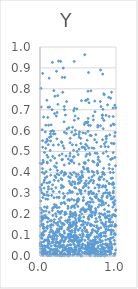
| Category | Series 0 |
|---|---|
| 0.10005947869981213 | 0.143 |
| 0.7445378313837614 | 0.294 |
| 0.43054060785528625 | 0.355 |
| 0.8630222613279245 | 0.336 |
| 0.7097267666635523 | 0.515 |
| 0.9165853605512814 | 0.007 |
| 0.1636997151240278 | 0.6 |
| 0.12031105227243544 | 0.851 |
| 0.3989803611448136 | 0.2 |
| 0.5937657782751368 | 0.639 |
| 0.8635882616032824 | 0.054 |
| 0.7287658117575289 | 0.028 |
| 0.5123858076969392 | 0.582 |
| 0.661117129698669 | 0.277 |
| 0.6094726828337561 | 0.745 |
| 0.46205400400438745 | 0.67 |
| 0.7003078070373357 | 0.013 |
| 0.8784946279181295 | 0.055 |
| 0.7924498252195591 | 0.004 |
| 0.7418793047803254 | 0.006 |
| 0.3208801798566193 | 0.593 |
| 0.6749692163662122 | 0.209 |
| 0.21782785934607152 | 0.445 |
| 0.9252433840730637 | 0.07 |
| 0.5034362676467412 | 0.39 |
| 0.7201226673238331 | 0.014 |
| 0.8017776033466113 | 0.02 |
| 0.5052967034909387 | 0.087 |
| 0.8033092494327827 | 0.11 |
| 0.7835920786173919 | 0.365 |
| 0.5067198892116997 | 0.019 |
| 0.29130712618294596 | 0.087 |
| 0.7187526788977328 | 0.018 |
| 0.08048620076550639 | 0.545 |
| 0.03182879926721438 | 0.418 |
| 0.07997170008571153 | 0.404 |
| 0.16299383746125584 | 0.119 |
| 0.4438434806434466 | 0.4 |
| 0.758897675626249 | 0.038 |
| 0.6080253942944378 | 0.336 |
| 0.03026466850193088 | 0.401 |
| 0.349664673779262 | 0.739 |
| 0.6541800906229215 | 0.005 |
| 0.6313878557279019 | 0.788 |
| 0.2657184033991986 | 0.166 |
| 0.7918979715776909 | 0.075 |
| 0.13531090307451177 | 0.413 |
| 0.8797384263612631 | 0.058 |
| 0.7122122962614431 | 0.145 |
| 0.022612676940649612 | 0.343 |
| 0.7038670591202029 | 0.4 |
| 0.06928909977648423 | 0.594 |
| 0.9338999021274117 | 0.624 |
| 0.9172055125395175 | 0.58 |
| 0.2928808077457361 | 0.855 |
| 0.8890523921128682 | 0.723 |
| 0.4417450240718055 | 0.506 |
| 0.19169418839615093 | 0.43 |
| 0.09969122263481289 | 0.073 |
| 0.8191094995074694 | 0.33 |
| 0.43973961297535324 | 0.473 |
| 0.2322028022714917 | 0.113 |
| 0.4497094916434805 | 0.931 |
| 0.011666211031531759 | 0.802 |
| 0.4042130408742949 | 0.204 |
| 0.2495374828566702 | 0.28 |
| 0.44357555218036315 | 0.15 |
| 0.8356040040496929 | 0.149 |
| 0.9555424806792121 | 0.162 |
| 0.29296256269814136 | 0.02 |
| 0.7851707170205758 | 0.187 |
| 0.9432235512853036 | 0.186 |
| 0.39934112240760267 | 0.017 |
| 0.8342210221445432 | 0.398 |
| 0.1708517440549171 | 0.11 |
| 0.633686262879085 | 0.225 |
| 0.6821782333649639 | 0.057 |
| 0.942841582585219 | 0.277 |
| 0.8642399651534727 | 0.077 |
| 0.7573118247019488 | 0.018 |
| 0.6587339549849187 | 0.024 |
| 0.05686589710546974 | 0.049 |
| 0.5215883229401814 | 0.072 |
| 0.6553243074449455 | 0.222 |
| 0.27680429236506154 | 0.184 |
| 0.8763295407086023 | 0.141 |
| 0.11136745482231014 | 0.321 |
| 0.16300426735947704 | 0.012 |
| 0.9105380790470909 | 0.438 |
| 0.9812943476231264 | 0.141 |
| 0.1843511507801644 | 0.032 |
| 0.8466326663791226 | 0.537 |
| 0.5181954103897375 | 0.194 |
| 0.30675062375419426 | 0.899 |
| 0.574999923362885 | 0.187 |
| 0.6557444137023243 | 0.485 |
| 0.40046611045646885 | 0.104 |
| 0.8787049950914343 | 0.573 |
| 0.6317477301085012 | 0.596 |
| 0.2731755349815663 | 0.046 |
| 0.058162191623783 | 0.071 |
| 0.12010398470827743 | 0.002 |
| 0.7467943281750345 | 0.137 |
| 0.9300959059781894 | 0.021 |
| 0.7308346773350012 | 0.059 |
| 0.46100930334965795 | 0.113 |
| 0.9058651164642031 | 0.043 |
| 0.6166225163946337 | 0.487 |
| 0.48602892122445684 | 0.704 |
| 0.4434908909907642 | 0.069 |
| 0.1417926599464856 | 0.003 |
| 0.566306441189867 | 0.326 |
| 0.3263061173754387 | 0.399 |
| 0.6811130888307021 | 0.187 |
| 0.7110240222283751 | 0.049 |
| 0.46091444940374793 | 0.04 |
| 0.054023461053276156 | 0.325 |
| 0.5312892187073107 | 0.035 |
| 0.31365110018370146 | 0.067 |
| 0.8545953921807845 | 0.014 |
| 0.0014893267014393086 | 0.047 |
| 0.017575329024499764 | 0.206 |
| 0.3087176924503304 | 0.33 |
| 0.4747696073553378 | 0.247 |
| 0.051538338839615894 | 0.292 |
| 0.09798102592095204 | 0.162 |
| 0.5222775390768457 | 0.351 |
| 0.22775697738634904 | 0.094 |
| 0.51367566166667 | 0.035 |
| 0.593404318458394 | 0.052 |
| 0.1643648376232637 | 0.028 |
| 0.6113574752132708 | 0.029 |
| 0.4276904855941217 | 0.307 |
| 0.9391030597206951 | 0.114 |
| 0.5625921340951926 | 0.058 |
| 0.7613014772407035 | 0.064 |
| 0.2783794897649168 | 0.25 |
| 0.686774478431224 | 0.405 |
| 0.7202595159701953 | 0.089 |
| 0.5506136604619367 | 0.001 |
| 0.3952175950402411 | 0.119 |
| 0.7585693539133623 | 0.434 |
| 0.6007606910871399 | 0.535 |
| 0.903863519514909 | 0.759 |
| 0.31027220387384635 | 0.052 |
| 0.253842787553743 | 0.481 |
| 0.4315993728213461 | 0.189 |
| 0.7300229222903388 | 0.164 |
| 0.11502004537350208 | 0.003 |
| 0.844982349091273 | 0.024 |
| 0.4504680581524416 | 0.09 |
| 0.49238475764072176 | 0.297 |
| 0.6664044295342217 | 0.153 |
| 0.3168728163324743 | 0.15 |
| 0.00695215168565444 | 0.063 |
| 0.9721971071560779 | 0.327 |
| 0.08218943597758888 | 0.077 |
| 0.9749267108533186 | 0.003 |
| 0.09996595126507579 | 0.552 |
| 0.8091651708428228 | 0.242 |
| 0.04349086053404316 | 0.1 |
| 0.10626809439953178 | 0.002 |
| 0.669387652936136 | 0.31 |
| 0.2149052880733785 | 0.19 |
| 0.8905520458543791 | 0.302 |
| 0.46004031597911776 | 0.345 |
| 0.3803297650766245 | 0.138 |
| 0.9406845821222647 | 0.784 |
| 0.39870386454200357 | 0.395 |
| 0.8093875648933189 | 0.003 |
| 0.9019432819355105 | 0.048 |
| 0.48504284132457043 | 0.268 |
| 0.756187765223229 | 0.063 |
| 0.38481610247683185 | 0.357 |
| 0.4540878563477837 | 0.029 |
| 0.2545283872887647 | 0.128 |
| 0.676394745749286 | 0.364 |
| 0.722066881766388 | 0.196 |
| 0.9424857066479063 | 0.125 |
| 0.8612176050840341 | 0.152 |
| 0.5829307775144627 | 0.629 |
| 0.5473396422552135 | 0.041 |
| 0.2354628959305528 | 0.213 |
| 0.7536669051343439 | 0.068 |
| 0.32536190315899705 | 0.854 |
| 0.32575899615767223 | 0.008 |
| 0.431349361599091 | 0.03 |
| 0.04269093819013858 | 0.112 |
| 0.47348568804284286 | 0.011 |
| 0.5916055239252378 | 0.075 |
| 0.11974169366412313 | 0.069 |
| 0.3952520805961037 | 0.054 |
| 0.5508029635362461 | 0.201 |
| 0.6602613376932361 | 0.099 |
| 0.6575748742939462 | 0.195 |
| 0.26891781429918427 | 0.013 |
| 0.7865667012739112 | 0.079 |
| 0.8938622109990406 | 0.125 |
| 0.9241161754881684 | 0.014 |
| 0.028871181046662975 | 0.172 |
| 0.14725966220475328 | 0.122 |
| 0.6737425857995373 | 0.576 |
| 0.9547115888702261 | 0.196 |
| 0.9954131040679962 | 0.029 |
| 0.40073662963594214 | 0.456 |
| 0.12314266489298875 | 0.02 |
| 0.7067104434800168 | 0.36 |
| 0.20650817861703563 | 0.05 |
| 0.17888345991422694 | 0.597 |
| 0.8325519650644809 | 0.491 |
| 0.4498342967078305 | 0.007 |
| 0.9650353958083112 | 0.538 |
| 0.44214756406803246 | 0.058 |
| 0.7720292307480524 | 0.128 |
| 0.43474817332979576 | 0.071 |
| 0.04408048880767068 | 0.132 |
| 0.8887452069449642 | 0.212 |
| 0.7574044283492841 | 0.341 |
| 0.2688386559354292 | 0.046 |
| 0.8211674646626055 | 0.071 |
| 0.03314027736723513 | 0.19 |
| 0.5528786015885647 | 0.4 |
| 0.37772941039907104 | 0.269 |
| 0.964380346531579 | 0.089 |
| 0.8933128465249822 | 0.081 |
| 0.9099069941289507 | 0.667 |
| 0.5557114963875774 | 0.166 |
| 0.512949734629897 | 0.022 |
| 0.6626367593987135 | 0.624 |
| 0.6596037901145356 | 0.149 |
| 0.9430313453572345 | 0.464 |
| 0.07526149648039582 | 0.515 |
| 0.5657214786926443 | 0.59 |
| 0.7592705543421319 | 0.118 |
| 0.2271344789746953 | 0.392 |
| 0.5429946806685568 | 0.072 |
| 0.3886607574110823 | 0.1 |
| 0.2440163676436523 | 0.933 |
| 0.016038840159648293 | 0.713 |
| 0.004645562697447869 | 0.096 |
| 0.4715918837265952 | 0.171 |
| 0.6642870153420836 | 0.223 |
| 0.16229240714881477 | 0.218 |
| 0.6464140123381407 | 0.01 |
| 0.03346968773221759 | 0.05 |
| 0.681265641456944 | 0.148 |
| 0.3191109046586035 | 0.436 |
| 0.6037554169918973 | 0.344 |
| 0.5155837307712833 | 0.047 |
| 0.5883748322517915 | 0.963 |
| 0.25196977220713557 | 0.232 |
| 0.05902964885287987 | 0.013 |
| 0.23378754007508418 | 0.767 |
| 0.7855636983774172 | 0.377 |
| 0.7933019345617327 | 0.739 |
| 0.3712481320734349 | 0.134 |
| 0.866156531903306 | 0.572 |
| 0.9679697012738092 | 0.198 |
| 0.860128247456905 | 0.303 |
| 0.7315283970564934 | 0.063 |
| 0.7665151679758214 | 0.133 |
| 0.07513257593989286 | 0.545 |
| 0.4672696311982196 | 0.095 |
| 0.36725073336984815 | 0.228 |
| 0.8279709778574713 | 0.702 |
| 0.8030338670018171 | 0.524 |
| 0.8782684436973298 | 0.316 |
| 0.8911405068261886 | 0.191 |
| 0.8200909158756926 | 0.158 |
| 0.6727429210462079 | 0.214 |
| 0.5587291717005823 | 0.148 |
| 0.5317576183440097 | 0.183 |
| 0.48934244710960373 | 0.265 |
| 0.7354029802799369 | 0.209 |
| 0.46183929285896397 | 0.131 |
| 0.2925938144354957 | 0.098 |
| 0.6718407447976029 | 0.032 |
| 0.19263142229345387 | 0.468 |
| 0.9551297588859718 | 0.373 |
| 0.19285318968806953 | 0.008 |
| 0.11245644085033046 | 0.626 |
| 0.11012014122321123 | 0.331 |
| 0.5686919065350118 | 0.151 |
| 0.13913439283394458 | 0.55 |
| 0.9143186791985006 | 0.079 |
| 0.7671915727152859 | 0.271 |
| 0.7595533119901697 | 0.396 |
| 0.6739262483281027 | 0.109 |
| 0.35815232096513394 | 0.022 |
| 0.4636010201506958 | 0.041 |
| 0.19772422438597625 | 0.584 |
| 0.8477532165405525 | 0 |
| 0.8826490308326922 | 0.05 |
| 0.04113095588336013 | 0.004 |
| 0.4304472678792396 | 0.161 |
| 0.37110699026893257 | 0.105 |
| 0.4202136665972257 | 0.122 |
| 0.21485834516508462 | 0.67 |
| 0.4989650893541351 | 0.237 |
| 0.07276314651617988 | 0.12 |
| 0.28248988557697385 | 0.547 |
| 0.8146347706086617 | 0.004 |
| 0.20422568763640558 | 0.048 |
| 0.2734443964118898 | 0.097 |
| 0.3684981203569022 | 0.008 |
| 0.8046432660146257 | 0.202 |
| 0.45996116122931463 | 0.122 |
| 0.021232561617691714 | 0.34 |
| 0.2799419081469655 | 0.001 |
| 0.5525639247415998 | 0.52 |
| 0.5845284383437503 | 0.519 |
| 0.8367442697527886 | 0.419 |
| 0.3873427085184815 | 0.098 |
| 0.15136968854694777 | 0.17 |
| 0.27687449505805395 | 0.37 |
| 0.8025387242125401 | 0.715 |
| 0.5693211098908796 | 0.265 |
| 0.06418817984263359 | 0.024 |
| 0.5374931382095133 | 0.024 |
| 0.7820065269940704 | 0.203 |
| 0.28582768209877685 | 0.155 |
| 0.12475222802142283 | 0.057 |
| 0.022611825828253496 | 0.22 |
| 0.6277802495694685 | 0.639 |
| 0.03198719359011348 | 0.045 |
| 0.4460728449092839 | 0.022 |
| 0.9930978811195681 | 0.191 |
| 0.9348918285202946 | 0.014 |
| 0.31606128621074636 | 0.642 |
| 0.9166183640992986 | 0.303 |
| 0.32156633221287967 | 0.029 |
| 0.26025775750195923 | 0.14 |
| 0.7178103601902595 | 0.033 |
| 0.2161705813867527 | 0.003 |
| 0.480949218330198 | 0.077 |
| 0.19615387817771357 | 0.764 |
| 0.5294324867019804 | 0.007 |
| 0.9993674720956293 | 0.146 |
| 0.6181557014816518 | 0.094 |
| 0.6382642477687822 | 0.878 |
| 0.38978203685485324 | 0.266 |
| 0.7073257171165988 | 0.05 |
| 0.913285513457537 | 0.193 |
| 0.7349973998958622 | 0.032 |
| 0.38587751625898314 | 0.087 |
| 0.07627049096563543 | 0.626 |
| 0.24749562443121975 | 0.061 |
| 0.22588792875948283 | 0.115 |
| 0.47085194924348217 | 0.154 |
| 0.6486429840216764 | 0.055 |
| 0.10377085397682095 | 0.001 |
| 0.26657285292328536 | 0.204 |
| 0.3930558374427827 | 0.478 |
| 0.7346770614415787 | 0.219 |
| 0.5163101272744196 | 0.167 |
| 0.6802508247863805 | 0.012 |
| 0.6553277912725691 | 0.193 |
| 0.5561846364591516 | 0.121 |
| 0.6943201198608615 | 0.03 |
| 0.2293452327258677 | 0.41 |
| 0.4895374630865206 | 0.077 |
| 0.5790935847697538 | 0.416 |
| 0.3696819246729375 | 0.173 |
| 0.6386571682292365 | 0.626 |
| 0.7793025168808232 | 0.337 |
| 0.47551455151307576 | 0.044 |
| 0.9622054108352334 | 0.257 |
| 0.42343896865061426 | 0.115 |
| 0.8006663313245564 | 0.266 |
| 0.42712414009486144 | 0.025 |
| 0.9924868212540667 | 0.218 |
| 0.14778938609392722 | 0.048 |
| 0.1437548814331695 | 0.572 |
| 0.10636134830161081 | 0.712 |
| 0.9142494474527716 | 0.178 |
| 0.7024585840397701 | 0.209 |
| 0.5255858179997775 | 0.101 |
| 0.7379577270951871 | 0.179 |
| 0.555500609127446 | 0.052 |
| 0.03794466298370103 | 0.179 |
| 0.19780095210043191 | 0.018 |
| 0.8312238859107838 | 0.01 |
| 0.8182202115637429 | 0.02 |
| 0.1297802942208357 | 0.016 |
| 0.904687218219109 | 0.297 |
| 0.7784623702779884 | 0.264 |
| 0.9441669303600607 | 0.039 |
| 0.5464704101738356 | 0.148 |
| 0.4111346997928532 | 0.096 |
| 0.6581673117613183 | 0.357 |
| 0.7926839763562441 | 0.094 |
| 0.09819950472813666 | 0.019 |
| 0.23559000001392993 | 0.004 |
| 0.18409005331610584 | 0.078 |
| 0.16986865115042438 | 0.194 |
| 0.917506587026175 | 0.168 |
| 0.08660952384822629 | 0.291 |
| 0.056765328681819605 | 0.394 |
| 0.46286398757069713 | 0.209 |
| 0.2504764104519983 | 0.281 |
| 0.5376612159909069 | 0 |
| 0.766136210554619 | 0.234 |
| 0.61802474134755 | 0.149 |
| 0.38620794559051697 | 0.15 |
| 0.9639793815194428 | 0.302 |
| 0.8729712994918841 | 0.5 |
| 0.09210163974448238 | 0.38 |
| 0.451551956694636 | 0.649 |
| 0.4177783096235893 | 0.272 |
| 0.07090507563889126 | 0.374 |
| 0.365167368170656 | 0.268 |
| 0.5405324677804243 | 0.002 |
| 0.4826544226346241 | 0.16 |
| 0.017894889717262386 | 0.016 |
| 0.6298103761295364 | 0.75 |
| 0.21745488671607827 | 0.884 |
| 0.04404166407263976 | 0.067 |
| 0.5137800686861382 | 0.175 |
| 0.7647815617761763 | 0.046 |
| 0.060244002738363056 | 0.234 |
| 0.5622294893412422 | 0.378 |
| 0.4610227617167927 | 0.074 |
| 0.554256594708845 | 0.04 |
| 0.17874025892584844 | 0.584 |
| 0.37867610559054077 | 0.012 |
| 0.3140449050404437 | 0.07 |
| 0.5564067189316539 | 0.122 |
| 0.30299303389793597 | 0.527 |
| 0.06764631461586101 | 0.015 |
| 0.2700047564953496 | 0.065 |
| 0.6775103190564966 | 0.238 |
| 0.4105165370719396 | 0.074 |
| 0.3926330998527383 | 0.08 |
| 0.07842463613931738 | 0.043 |
| 0.1832885489285796 | 0.161 |
| 0.9346958083880466 | 0.272 |
| 0.6943364268132837 | 0.454 |
| 0.04167367351822304 | 0.188 |
| 0.03316156510482837 | 0.552 |
| 0.16350518268642733 | 0.08 |
| 0.22510149642891697 | 0.033 |
| 0.0923798863238523 | 0.139 |
| 0.19574145971209955 | 0.384 |
| 0.6957252076240931 | 0.023 |
| 0.21608587298388848 | 0.019 |
| 0.847981354440766 | 0.007 |
| 0.4944819938961984 | 0.004 |
| 0.965386639810704 | 0.31 |
| 0.561215444626206 | 0.016 |
| 0.8986169889543645 | 0.021 |
| 0.39805127439518717 | 0.346 |
| 0.12344876830887275 | 0.037 |
| 0.9040577596728738 | 0.033 |
| 0.813168745934918 | 0.018 |
| 0.7349182221980097 | 0.581 |
| 0.18628418371901012 | 0.095 |
| 0.1750805972994992 | 0.309 |
| 0.5265132388523813 | 0.379 |
| 0.4699743590294515 | 0.131 |
| 0.8968587276415232 | 0.126 |
| 0.3956937035034348 | 0.146 |
| 0.764910063928205 | 0.024 |
| 0.7020920049035496 | 0.651 |
| 0.7518897451570211 | 0.491 |
| 0.6068122390889117 | 0.046 |
| 0.06837905452172399 | 0.195 |
| 0.007387868170267375 | 0.018 |
| 0.5405841430731395 | 0.222 |
| 0.2735425841359851 | 0.073 |
| 0.5069685617690979 | 0.012 |
| 0.07270622657666137 | 0.046 |
| 0.3070254235496407 | 0.299 |
| 0.3439176798436703 | 0.202 |
| 0.6384417587273533 | 0.037 |
| 0.9503795864794164 | 0.343 |
| 0.5950711629716261 | 0.447 |
| 0.014669128168392387 | 0.188 |
| 0.63884012860272 | 0.187 |
| 0.18813082126999303 | 0.362 |
| 0.970680481099592 | 0.283 |
| 0.3637104055246281 | 0.127 |
| 0.929741548882098 | 0.755 |
| 0.40349823278492003 | 0.105 |
| 0.41800040468628485 | 0.453 |
| 0.934971771894662 | 0.062 |
| 0.9767462196823684 | 0.194 |
| 0.3845615503165677 | 0.443 |
| 0.6274379227026118 | 0.043 |
| 0.36341787081916765 | 0.052 |
| 0.28984037791281614 | 0.051 |
| 0.4936734993672477 | 0.067 |
| 0.46830406245196077 | 0.2 |
| 0.3890586207143055 | 0.313 |
| 0.7104365918522202 | 0.387 |
| 0.7518555614534216 | 0.165 |
| 0.3957409539699186 | 0.136 |
| 0.631107384569193 | 0.159 |
| 0.7923850690888616 | 0.033 |
| 0.5667264114056368 | 0.23 |
| 0.2827427642692627 | 0.13 |
| 0.288495390805676 | 0.14 |
| 0.7961333802543007 | 0.623 |
| 0.36736528596094364 | 0.051 |
| 0.39792827830576416 | 0.563 |
| 0.7238213294553322 | 0.326 |
| 0.6994464221289396 | 0.67 |
| 0.4993934486378053 | 0.262 |
| 0.8313537376574572 | 0.609 |
| 0.4263128773165422 | 0.142 |
| 0.10673415273830977 | 0.08 |
| 0.3225741519952936 | 0.11 |
| 0.9818648495096978 | 0.573 |
| 0.9980209443198514 | 0.221 |
| 0.9115843577501281 | 0.419 |
| 0.12448056738420721 | 0.568 |
| 0.03677126034743994 | 0.149 |
| 0.2777173247424757 | 0.397 |
| 0.03730235590298947 | 0.036 |
| 0.7978142383412998 | 0.172 |
| 0.2109438048433393 | 0.375 |
| 0.6525527752312029 | 0.007 |
| 0.38203839343071555 | 0.038 |
| 0.25728860367343864 | 0.066 |
| 0.40025055978320123 | 0.09 |
| 0.44354799978491277 | 0.695 |
| 0.1474000845012905 | 0.032 |
| 0.6415326868762692 | 0.306 |
| 0.5048079551477731 | 0.365 |
| 0.04528023907946477 | 0.019 |
| 0.14591898090581823 | 0.125 |
| 0.41829260834262183 | 0.388 |
| 0.008170951084375488 | 0.145 |
| 0.034783327601892844 | 0.874 |
| 0.29946636670736526 | 0.783 |
| 0.8978203720565261 | 0.523 |
| 0.7118131276415984 | 0.072 |
| 0.0944592013765686 | 0.235 |
| 0.3852915285174784 | 0.014 |
| 0.8131419388215692 | 0.255 |
| 0.20649180912388032 | 0.112 |
| 0.1635733243299201 | 0.926 |
| 0.3127801998801726 | 0.277 |
| 0.02789209196505993 | 0.085 |
| 0.7835719142435517 | 0.366 |
| 0.025790630282838345 | 0.303 |
| 0.016196427528462287 | 0.107 |
| 0.6964350055925389 | 0.076 |
| 0.27284776246188547 | 0.211 |
| 0.9617737547554462 | 0.708 |
| 0.1202922222451962 | 0.209 |
| 0.028557326892020063 | 0.604 |
| 0.6244314421921099 | 0.113 |
| 0.3364955189391363 | 0.169 |
| 0.7363761209674813 | 0.279 |
| 0.8733034881819923 | 0.022 |
| 0.09180227314334788 | 0.23 |
| 0.8308392749279534 | 0.196 |
| 0.5814925486618605 | 0.222 |
| 0.2567048934675682 | 0.042 |
| 0.21783380136738562 | 0.027 |
| 0.8097562317517566 | 0.379 |
| 0.07064650219544366 | 0.028 |
| 0.3392008928110237 | 0.081 |
| 0.3766123602331253 | 0.033 |
| 0.8397295118290238 | 0.776 |
| 0.921591862409581 | 0.175 |
| 0.2896984677280513 | 0.366 |
| 0.637439648041338 | 0.088 |
| 0.4106997269317222 | 0.345 |
| 0.6600851190806007 | 0.577 |
| 0.7729688755486284 | 0.369 |
| 0.35807948398760003 | 0.09 |
| 0.21971756447423663 | 0.013 |
| 0.20886293242488474 | 0.327 |
| 0.6336351580809476 | 0.41 |
| 0.6723434672714171 | 0.231 |
| 0.5963278281386285 | 0.16 |
| 0.6801896543574101 | 0.048 |
| 0.5086009976722116 | 0.181 |
| 0.5787654506371632 | 0.333 |
| 0.8477225049961102 | 0.141 |
| 0.1377614790102819 | 0.091 |
| 0.9243159428573369 | 0.123 |
| 0.05244068039090122 | 0.027 |
| 0.046036489082293075 | 0.14 |
| 0.16632556254340758 | 0.477 |
| 0.46471583198017374 | 0.601 |
| 0.2283882518452871 | 0.129 |
| 0.28715315782242345 | 0.461 |
| 0.03428605832592013 | 0.028 |
| 0.9128737708038432 | 0.023 |
| 0.7008301896550985 | 0.022 |
| 0.3172086531823204 | 0.257 |
| 0.16468019684419755 | 0.065 |
| 0.7976236830840744 | 0.021 |
| 0.859245457151165 | 0.109 |
| 0.7598287126240715 | 0.617 |
| 0.5101938428801216 | 0.269 |
| 0.25455552370503776 | 0.307 |
| 0.5990935173268164 | 0.587 |
| 0.5285498558801071 | 0.308 |
| 0.3333039756827235 | 0.21 |
| 0.2460023146574135 | 0.211 |
| 0.6705744789103565 | 0.145 |
| 0.44536326748563193 | 0.162 |
| 0.40029651918895437 | 0.212 |
| 0.10249028715522068 | 0.663 |
| 0.2866794985428407 | 0.405 |
| 0.15252169846281838 | 0.321 |
| 0.7237230107732979 | 0.69 |
| 0.7014169874395318 | 0.258 |
| 0.3404868834095399 | 0.392 |
| 0.5053853326053492 | 0.069 |
| 0.22156820959021395 | 0.281 |
| 0.8763311825787274 | 0.005 |
| 0.7425454102029655 | 0.283 |
| 0.9561093818101721 | 0.416 |
| 0.4485074419196794 | 0.267 |
| 0.059545399666081855 | 0.495 |
| 0.19220856487707472 | 0.006 |
| 0.7809600959615944 | 0.245 |
| 0.28367676493437755 | 0.253 |
| 0.29160847870314044 | 0.002 |
| 0.004691958905367333 | 0.06 |
| 0.799803454845614 | 0.136 |
| 0.9265578473437108 | 0.289 |
| 0.18759670897953096 | 0.02 |
| 0.5046062968232681 | 0.123 |
| 0.7133591000589992 | 0.038 |
| 0.2576859308298799 | 0.001 |
| 0.4432776083036324 | 0.092 |
| 0.29070152496692336 | 0.488 |
| 0.4092537949155287 | 0.232 |
| 0.6575440197808905 | 0.259 |
| 0.416508109800827 | 0.34 |
| 0.2154989298911002 | 0.07 |
| 0.3546916974993517 | 0.608 |
| 0.4712740165474947 | 0.325 |
| 0.6434359344644645 | 0.1 |
| 0.5937587660300139 | 0.311 |
| 0.10538147746866933 | 0.472 |
| 0.9417235329953 | 0.043 |
| 0.9091414365512998 | 0.164 |
| 0.313994137648987 | 0.153 |
| 0.39108865307009044 | 0.023 |
| 0.18936640644695513 | 0.247 |
| 0.30181820924424585 | 0.332 |
| 0.45555604738451516 | 0.231 |
| 0.748968051680556 | 0.144 |
| 0.059566631510429624 | 0.035 |
| 0.047887078283295303 | 0.665 |
| 0.8416007004055397 | 0.649 |
| 0.6295587310843477 | 0.642 |
| 0.17949618173659465 | 0.007 |
| 0.23340856756577377 | 0.148 |
| 0.4789106366457856 | 0.044 |
| 0.4294359321352206 | 0.005 |
| 0.09844792113299006 | 0.05 |
| 0.2976843192805828 | 0.155 |
| 0.3948804365736809 | 0.187 |
| 0.9110517541856028 | 0.043 |
| 0.5631159599886212 | 0.521 |
| 0.6317650949486633 | 0.057 |
| 0.34250167773382 | 0.479 |
| 0.7253785021622636 | 0.207 |
| 0.6286335722855241 | 0.42 |
| 0.45758523161153775 | 0.025 |
| 0.2171547212029653 | 0.019 |
| 0.9093862839199459 | 0.347 |
| 0.8631444333151194 | 0.058 |
| 0.71983054964555 | 0.557 |
| 0.8315871289641857 | 0.336 |
| 0.20887801127505679 | 0.047 |
| 0.5893914984482935 | 0.017 |
| 0.47725563412508254 | 0.088 |
| 0.04741703538402464 | 0.133 |
| 0.3603959490011932 | 0.16 |
| 0.3722156501401602 | 0.001 |
| 0.2616850712912058 | 0.105 |
| 0.4329317032653547 | 0.027 |
| 0.1299743637930082 | 0.354 |
| 0.2343332128742439 | 0.065 |
| 0.6742326493630644 | 0.016 |
| 0.8402128776385559 | 0.367 |
| 0.4403260489232447 | 0.095 |
| 0.9122863666179893 | 0.041 |
| 0.5868595038081438 | 0.138 |
| 0.2987062740354238 | 0.156 |
| 0.4485324319352173 | 0.24 |
| 0.6301692099074848 | 0.257 |
| 0.5705796651431024 | 0.267 |
| 0.2827469268880295 | 0.013 |
| 0.4330876056239542 | 0.019 |
| 0.8368007664152531 | 0.3 |
| 0.7744740992932564 | 0.31 |
| 0.3464281930876625 | 0.006 |
| 0.7958585691841649 | 0.052 |
| 0.48714171471261025 | 0.5 |
| 0.5885330595629474 | 0.348 |
| 0.4221650512507438 | 0.15 |
| 0.8945575333108545 | 0.477 |
| 0.7589392211036469 | 0.443 |
| 0.9896022754350879 | 0.151 |
| 0.4710016844603153 | 0.098 |
| 0.5986029692179792 | 0.017 |
| 0.6711703461972461 | 0.108 |
| 0.7305766429833502 | 0.227 |
| 0.6850559061432037 | 0.069 |
| 0.5027868365958917 | 0.346 |
| 0.6300246112259675 | 0.065 |
| 0.592170989813522 | 0.212 |
| 0.1263202855349681 | 0.713 |
| 0.15996494384438786 | 0.093 |
| 0.888455384418554 | 0.042 |
| 0.8396360031246743 | 0.039 |
| 0.2108275297970954 | 0.156 |
| 0.9629674430489075 | 0.667 |
| 0.9666967891034834 | 0.121 |
| 0.016315538622176717 | 0.184 |
| 0.6992588089923841 | 0.303 |
| 0.8169731557195874 | 0.037 |
| 0.21402303953965562 | 0.424 |
| 0.7772730096737308 | 0.328 |
| 0.1423703341450081 | 0.596 |
| 0.6365541814647465 | 0.081 |
| 0.16604645073848767 | 0.229 |
| 0.8605294184302805 | 0.33 |
| 0.7201913737333782 | 0.741 |
| 0.12975989188588477 | 0.113 |
| 0.45217103506599476 | 0.054 |
| 0.25028451218705583 | 0.388 |
| 0.490702763950256 | 0.092 |
| 0.2983582604481909 | 0.097 |
| 0.16610961536898672 | 0.341 |
| 0.6524692560291738 | 0.301 |
| 0.491256724725637 | 0.259 |
| 0.8660759361219817 | 0.094 |
| 0.6623629508870843 | 0.072 |
| 0.037162801976805215 | 0.28 |
| 0.3190986242242494 | 0.716 |
| 0.6914844093546954 | 0.043 |
| 0.38932987984276435 | 0.007 |
| 0.3941726808035485 | 0.008 |
| 0.642835199041861 | 0.175 |
| 0.41797847881232475 | 0.592 |
| 0.6448733335991519 | 0.733 |
| 0.3728235793418503 | 0.169 |
| 0.9767797269225015 | 0.075 |
| 0.05362270417585857 | 0.027 |
| 0.6903534006778249 | 0.123 |
| 0.030965445883454845 | 0.005 |
| 0.45519324499334124 | 0.015 |
| 0.3305535168195839 | 0.207 |
| 0.5149418107059477 | 0.568 |
| 0.8673879661333164 | 0.163 |
| 0.2222540995583393 | 0.561 |
| 0.48664655457888606 | 0.048 |
| 0.9382126259669118 | 0.144 |
| 0.5292458024597154 | 0.134 |
| 0.6388251723025021 | 0.349 |
| 0.7108044721783442 | 0.449 |
| 0.7525731754705685 | 0.009 |
| 0.49905662743332846 | 0.063 |
| 0.905224724236286 | 0.025 |
| 0.9134812258043733 | 0.346 |
| 0.8328888023327973 | 0.031 |
| 0.04328508373252926 | 0.152 |
| 0.9844753530667558 | 0.058 |
| 0.6406621142002439 | 0.517 |
| 0.9642119302732917 | 0.345 |
| 0.8211301131378002 | 0.675 |
| 0.58045565187932 | 0.447 |
| 0.8143092040350157 | 0.28 |
| 0.724154402053327 | 0.077 |
| 0.4694771504140761 | 0.029 |
| 0.3121736470119084 | 0.09 |
| 0.8933862490824089 | 0.022 |
| 0.792104648469605 | 0 |
| 0.1753234314650559 | 0.53 |
| 0.22782287770767384 | 0.046 |
| 0.09564632564423681 | 0.307 |
| 0.9459421279337935 | 0.147 |
| 0.9649832236935287 | 0.399 |
| 0.4263571217477271 | 0.094 |
| 0.6052749065237156 | 0.22 |
| 0.025239349518444087 | 0.099 |
| 0.8232948366482492 | 0.556 |
| 0.7031874556525887 | 0.059 |
| 0.023383055934840247 | 0.441 |
| 0.5688929216251193 | 0.166 |
| 0.5575735864993681 | 0.387 |
| 0.09058870115321915 | 0.745 |
| 0.32245192167574777 | 0.7 |
| 0.9855886210706094 | 0.107 |
| 0.313797894787752 | 0.008 |
| 0.2011463657184397 | 0.01 |
| 0.3250987725262746 | 0.395 |
| 0.2965075137690044 | 0.462 |
| 0.8224697592405555 | 0.659 |
| 0.880767337079318 | 0.358 |
| 0.33356742303413445 | 0.041 |
| 0.2979275345958494 | 0.041 |
| 0.9765712143781943 | 0.107 |
| 0.5303038453841353 | 0.212 |
| 0.1343487775672244 | 0.146 |
| 0.2450844654104214 | 0.117 |
| 0.5361120655280223 | 0.376 |
| 0.4546156350116931 | 0.706 |
| 0.4613149819279079 | 0.023 |
| 0.4088320290668014 | 0.038 |
| 0.18190846073126243 | 0.791 |
| 0.3965532698815307 | 0.491 |
| 0.5398024364647175 | 0.313 |
| 0.04036503699516791 | 0.458 |
| 0.23632567250229763 | 0.16 |
| 0.6463898223633694 | 0.026 |
| 0.9745650936401834 | 0.538 |
| 0.3878801293970222 | 0.174 |
| 0.8255721299514326 | 0.871 |
| 0.005981031910289425 | 0.23 |
| 0.8422935594687531 | 0.095 |
| 0.7950886463163488 | 0.066 |
| 0.6756390250514748 | 0.038 |
| 0.20776435911077074 | 0.099 |
| 0.10090925254563132 | 0.017 |
| 0.3483448892609766 | 0.587 |
| 0.47363931071228915 | 0.031 |
| 0.9647400339115577 | 0.343 |
| 0.3957631062262258 | 0.542 |
| 0.626603660465937 | 0.05 |
| 0.808622404787767 | 0.159 |
| 0.44693728459254467 | 0.578 |
| 0.6459075421917322 | 0.244 |
| 0.007667832322166612 | 0.034 |
| 0.12380067802566319 | 0.017 |
| 0.14166469387739067 | 0.026 |
| 0.23548436190431343 | 0.726 |
| 0.10873262058082112 | 0.533 |
| 0.12119983500594378 | 0.1 |
| 0.8724586571840178 | 0.561 |
| 0.6145602376289223 | 0.034 |
| 0.2596545415327206 | 0.04 |
| 0.6107324297103357 | 0.247 |
| 0.17733341581567763 | 0.109 |
| 0.2044163739158067 | 0.031 |
| 0.5919579212454528 | 0.443 |
| 0.08027164066993475 | 0.009 |
| 0.045448560385881076 | 0.449 |
| 0.6464980427054254 | 0.053 |
| 0.6642636775581042 | 0.257 |
| 0.32631805171881767 | 0.198 |
| 0.633309282785475 | 0.18 |
| 0.8683280754191187 | 0.546 |
| 0.822700413959058 | 0.288 |
| 0.43289289051443325 | 0.204 |
| 0.7836473323977106 | 0.188 |
| 0.39878293152484656 | 0.375 |
| 0.5844096621734883 | 0.133 |
| 0.2820827609105785 | 0.019 |
| 0.324505486563761 | 0.073 |
| 0.9308778563053479 | 0.038 |
| 0.7728512747339867 | 0.1 |
| 0.3931129896104093 | 0.018 |
| 0.5726260242383109 | 0.28 |
| 0.09635996235482813 | 0.132 |
| 0.052009950120478265 | 0.118 |
| 0.42577115757727835 | 0.532 |
| 0.49489932649618396 | 0.05 |
| 0.6332893245889917 | 0.658 |
| 0.5411703593826865 | 0.297 |
| 0.6858852171808433 | 0.208 |
| 0.6836943486432459 | 0.033 |
| 0.24685490878654048 | 0.117 |
| 0.5982293721398049 | 0.51 |
| 0.04970806882996037 | 0.295 |
| 0.614650192358619 | 0.637 |
| 0.6129108388720518 | 0.009 |
| 0.20369374852362065 | 0.012 |
| 0.3285673961670852 | 0.251 |
| 0.8343734492734385 | 0.112 |
| 0.39672683030615163 | 0.106 |
| 0.5409154838734034 | 0.36 |
| 0.7254945775800099 | 0.12 |
| 0.09844254772185834 | 0.045 |
| 0.012031001481002335 | 0.166 |
| 0.4487613216809583 | 0.197 |
| 0.17839508677297244 | 0.015 |
| 0.13221147060309224 | 0.004 |
| 0.867765638059125 | 0.025 |
| 0.19011756788259793 | 0.051 |
| 0.28991266970462304 | 0.077 |
| 0.8008358114874855 | 0.095 |
| 0.011814943108713227 | 0.314 |
| 0.8673654680043226 | 0.187 |
| 0.6278187990675456 | 0.016 |
| 0.5645113587163673 | 0.037 |
| 0.638487794481582 | 0.403 |
| 0.3679844324617506 | 0.239 |
| 0.07631011357491502 | 0.273 |
| 0.8847086323825385 | 0.286 |
| 0.5337915404558498 | 0.371 |
| 0.905776338292399 | 0.141 |
| 0.16703741632337765 | 0.116 |
| 0.7722662032095092 | 0.006 |
| 0.6214350547882858 | 0.101 |
| 0.8530057242515386 | 0.202 |
| 0.4802540168143328 | 0.38 |
| 0.7244175667216208 | 0.284 |
| 0.4069887698289997 | 0.191 |
| 0.15384737920164904 | 0.29 |
| 0.9182228419403856 | 0.059 |
| 0.5041787628186994 | 0.658 |
| 0.728095924321666 | 0.078 |
| 0.11191667873250466 | 0.289 |
| 0.9857479767029179 | 0.472 |
| 0.18419094434006456 | 0.279 |
| 0.0448381050436476 | 0.102 |
| 0.5297820659828963 | 0.076 |
| 0.4501072603770453 | 0.1 |
| 0.9834585789258827 | 0.721 |
| 0.4711145571960479 | 0.393 |
| 0.10652465520033338 | 0.062 |
| 0.8534566847333416 | 0.038 |
| 0.5372065639582371 | 0.538 |
| 0.1724077336048545 | 0.147 |
| 0.9293541285757164 | 0.161 |
| 0.37150855298825325 | 0.464 |
| 0.14559028254672968 | 0.627 |
| 0.6698285971852869 | 0.79 |
| 0.9414116912369639 | 0.053 |
| 0.013213765172932379 | 0.065 |
| 0.7976171150878371 | 0.89 |
| 0.9099025447117518 | 0.211 |
| 0.0487133151145136 | 0.213 |
| 0.4294981682460791 | 0.616 |
| 0.049454802262724806 | 0.133 |
| 0.42087204136686773 | 0.077 |
| 0.6419886977370326 | 0.295 |
| 0.45421740532400057 | 0.328 |
| 0.4433851533280512 | 0.021 |
| 0.012361018717487071 | 0.057 |
| 0.6575157866802751 | 0.025 |
| 0.24363080361140133 | 0.532 |
| 0.2638568562477479 | 0.009 |
| 0.474451376824359 | 0.145 |
| 0.24053723973151597 | 0.123 |
| 0.1896135021141998 | 0.174 |
| 0.9350593881163339 | 0.012 |
| 0.5890903866865249 | 0.034 |
| 0.9798349917656032 | 0.057 |
| 0.6439709138033678 | 0.235 |
| 0.5077703718588363 | 0.35 |
| 0.9767650736844395 | 0.252 |
| 0.3900409848922377 | 0.091 |
| 0.4474214557418391 | 0.445 |
| 0.8270708962335453 | 0.057 |
| 0.976861647159551 | 0.629 |
| 0.3302220336731224 | 0.029 |
| 0.47619589129652884 | 0.026 |
| 0.03497824406907735 | 0.521 |
| 0.4717767163002531 | 0.193 |
| 0.8616666715559944 | 0.189 |
| 0.6365367217150897 | 0.458 |
| 0.37029949555918196 | 0.023 |
| 0.6546942708854184 | 0.041 |
| 0.1407493982835607 | 0.387 |
| 0.6979078205139632 | 0.029 |
| 0.8630432183219942 | 0.118 |
| 0.39963099776690236 | 0.028 |
| 0.5489938455241364 | 0.405 |
| 0.4559846390175306 | 0.354 |
| 0.3852589376117489 | 0.187 |
| 0.13455688508675967 | 0.505 |
| 0.7266055894947794 | 0.001 |
| 0.040432798043210316 | 0.009 |
| 0.599169561370163 | 0.744 |
| 0.151151207420692 | 0.151 |
| 0.002406098530218892 | 0.444 |
| 0.0018963033862440248 | 0.329 |
| 0.8657919050111518 | 0.13 |
| 0.9404566216012195 | 0.086 |
| 0.752605515033583 | 0.406 |
| 0.009146482754549878 | 0.263 |
| 0.991503877343983 | 0.193 |
| 0.31458330322201333 | 0.386 |
| 0.7603059375483876 | 0.089 |
| 0.24480124908704726 | 0.023 |
| 0.05933293504441217 | 0.136 |
| 0.22513450610316632 | 0.687 |
| 0.8616547018880807 | 0.182 |
| 0.07973218769861401 | 0.215 |
| 0.5932035263288111 | 0.015 |
| 0.7458987578310425 | 0.544 |
| 0.1859912626919631 | 0.103 |
| 0.7429047909444739 | 0.091 |
| 0.6868776832254785 | 0.299 |
| 0.7005502788670572 | 0.349 |
| 0.21240440997982613 | 0.117 |
| 0.6394536887459598 | 0.327 |
| 0.28679276329135606 | 0.543 |
| 0.414566738001502 | 0.142 |
| 0.3255313187531903 | 0.286 |
| 0.614717454056626 | 0.093 |
| 0.6857543225429987 | 0.379 |
| 0.5631859582088117 | 0.014 |
| 0.7245806328190756 | 0.002 |
| 0.5957243133403332 | 0.118 |
| 0.8685523514264827 | 0.673 |
| 0.7664251386220945 | 0.473 |
| 0.7520299320652455 | 0.435 |
| 0.09140457274427938 | 0.482 |
| 0.3029960100041832 | 0.028 |
| 0.3961461677283704 | 0.305 |
| 0.5905017213004207 | 0.443 |
| 0.5226366415429424 | 0.169 |
| 0.9627653232116856 | 0.351 |
| 0.8166783865464058 | 0.265 |
| 0.36394294741472266 | 0.3 |
| 0.937679705311242 | 0.371 |
| 0.2695476475135504 | 0.013 |
| 0.7443288869677289 | 0.114 |
| 0.7715039675933147 | 0.004 |
| 0.9628986807392915 | 0.495 |
| 0.5223242730266302 | 0.067 |
| 0.8386278855978992 | 0.246 |
| 0.1117091874579913 | 0.039 |
| 0.20073675487550002 | 0.005 |
| 0.3352155323682309 | 0.675 |
| 0.24170479679689938 | 0.36 |
| 0.4795734994408387 | 0.141 |
| 0.9139095503666976 | 0.174 |
| 0.8035974301834075 | 0.093 |
| 0.21304805666387716 | 0.243 |
| 0.9546995826733214 | 0.466 |
| 0.6449574315547951 | 0.374 |
| 0.4629431741247886 | 0.181 |
| 0.20942096338357552 | 0.062 |
| 0.8666458705858611 | 0.253 |
| 0.5027767752086757 | 0.485 |
| 0.04630253742994139 | 0.021 |
| 0.3807461654681076 | 0.269 |
| 0.39477179197099355 | 0.159 |
| 0.9432545653931925 | 0.032 |
| 0.13726974606956188 | 0.584 |
| 0.7253718473263311 | 0.492 |
| 0.2826697659401268 | 0.338 |
| 0.5703001159342115 | 0.425 |
| 0.7435801591335552 | 0.026 |
| 0.9023978595670181 | 0.241 |
| 0.7615910315822677 | 0.001 |
| 0.5604334773760412 | 0.108 |
| 0.5018443591458844 | 0.126 |
| 0.9965654770466789 | 0.709 |
| 0.20651455058465118 | 0.202 |
| 0.9566689917779823 | 0.275 |
| 0.31814787587555904 | 0.001 |
| 0.42396364160723177 | 0.238 |
| 0.45226504314961313 | 0.081 |
| 0.519954581120871 | 0.055 |
| 0.2719369142992082 | 0.931 |
| 0.2890793269073847 | 0.214 |
| 0.9288287990645824 | 0.462 |
| 0.831077392207004 | 0.257 |
| 0.31733455732603155 | 0.119 |
| 0.9877281911024267 | 0.591 |
| 0.5134297579125143 | 0.032 |
| 0.06408252836747097 | 0.077 |
| 0.09674599722424415 | 0.449 |
| 0.317442492341807 | 0.516 |
| 0.556532612715648 | 0.08 |
| 0.8460243000455077 | 0.772 |
| 0.42060744542195183 | 0.459 |
| 0.6585497002130937 | 0.018 |
| 0.6838995831823669 | 0.271 |
| 0.5677895418895118 | 0.101 |
| 0.15691807998458673 | 0.064 |
| 0.7503607579895205 | 0.11 |
| 0.607858431996131 | 0.359 |
| 0.6822748841090193 | 0.195 |
| 0.7290827414004587 | 0.064 |
| 0.3801575805879007 | 0.614 |
| 0.3381568942510027 | 0.042 |
| 0.3857339965221236 | 0.12 |
| 0.2553453264729669 | 0.053 |
| 0.9882317962429822 | 0.102 |
| 0.8231389369813251 | 0.401 |
| 0.5121228343615802 | 0.011 |
| 0.0776783044401338 | 0.183 |
| 0.11152321635765605 | 0.179 |
| 0.5459464571096019 | 0.743 |
| 0.7813121569630649 | 0.185 |
| 0.6137375767702118 | 0.251 |
| 0.5372341453361962 | 0.301 |
| 0.3887223313964755 | 0.003 |
| 0.0922064018940838 | 0.56 |
| 0.22344840153792478 | 0.232 |
| 0.1839804200402787 | 0.233 |
| 0.6065140395160139 | 0.215 |
| 0.0856221544243212 | 0.012 |
| 0.8831483483004986 | 0.279 |
| 0.21277219756175514 | 0.067 |
| 0.661957682650214 | 0.002 |
| 0.051647853544940725 | 0.353 |
| 0.9819707965310263 | 0.01 |
| 0.09118928526204462 | 0.349 |
| 0.6527765257289699 | 0.491 |
| 0.587899761741919 | 0.133 |
| 0.15824809313080035 | 0.7 |
| 0.25268474249170947 | 0.176 |
| 0.5154794289785922 | 0.439 |
| 0.5142833581058097 | 0.511 |
| 0.924688858318493 | 0.4 |
| 0.12152151903070396 | 0.351 |
| 0.8256431344049955 | 0.391 |
| 0.9765406167453832 | 0.245 |
| 0.37695012047832777 | 0.38 |
| 0.14124308007123776 | 0.137 |
| 0.4021928292496637 | 0.075 |
| 0.10767469137460972 | 0.089 |
| 0.6077970560684093 | 0.04 |
| 0.5833194824971902 | 0.013 |
| 0.9204561371020054 | 0.146 |
| 0.5164196584283198 | 0.318 |
| 0.5465005605536153 | 0.09 |
| 0.32404614635423523 | 0.038 |
| 0.6827185182143076 | 0.517 |
| 0.0959484875034543 | 0.182 |
| 0.7043755379080537 | 0.298 |
| 0.9232636582549297 | 0.084 |
| 0.6348703559422005 | 0.094 |
| 0.7610097504600493 | 0.625 |
| 0.8203466932089846 | 0.672 |
| 0.3477203419794087 | 0.034 |
| 0.8059923580319207 | 0.002 |
| 0.8051645928131905 | 0.017 |
| 0.4047590385941703 | 0.053 |
| 0.08034582905515797 | 0.186 |
| 0.9844333205360293 | 0.012 |
| 0.6414363829300173 | 0.038 |
| 0.3767146240174106 | 0.069 |
| 0.39106221794528206 | 0.008 |
| 0.17397428854700403 | 0.066 |
| 0.010300213752755916 | 0.321 |
| 0.5049162765201447 | 0.275 |
| 0.36315078410281765 | 0.022 |
| 0.27989495042117407 | 0.099 |
| 0.9603078903282107 | 0.348 |
| 0.6567476259942958 | 0.059 |
| 0.6339726597169463 | 0.022 |
| 0.46943158086507664 | 0.584 |
| 0.6043198422017655 | 0.22 |
| 0.19791244232056637 | 0.236 |
| 0.001460409231882731 | 0.057 |
| 0.8570340410335032 | 0.524 |
| 0.44808849045802845 | 0.475 |
| 0.1322054011727708 | 0.168 |
| 0.33290868345997493 | 0.087 |
| 0.14041942834015297 | 0.457 |
| 0.32377612330656635 | 0.012 |
| 0.5201814724948695 | 0.593 |
| 0.4765913669548062 | 0.531 |
| 0.016301472174180542 | 0.086 |
| 0.4171199795168117 | 0.305 |
| 0.4783949808982001 | 0.083 |
| 0.9922496047200943 | 0.432 |
| 0.7883252915399402 | 0.008 |
| 0.5362022298603096 | 0.563 |
| 0.38804131755702254 | 0.017 |
| 0.7961347416057433 | 0.106 |
| 0.7828937139034915 | 0.338 |
| 0.5105298436476268 | 0.37 |
| 0.8483740056380461 | 0.39 |
| 0.09564305382829441 | 0.444 |
| 0.7275707847728018 | 0.069 |
| 0.19149590739919398 | 0.681 |
| 0.6020986740916319 | 0.215 |
| 0.7663812908011125 | 0.461 |
| 0.024809418210210543 | 0.153 |
| 0.8173893319611775 | 0.045 |
| 0.5519876469790271 | 0.045 |
| 0.567706359520696 | 0.095 |
| 0.885517879022329 | 0.049 |
| 0.9855578727482208 | 0.265 |
| 0.21884611716537727 | 0.082 |
| 0.9348913052939567 | 0.104 |
| 0.6053488106103115 | 0.477 |
| 0.37837441503316227 | 0.008 |
| 0.5681075070424965 | 0.22 |
| 0.41218018913939336 | 0.037 |
| 0.6209527399357796 | 0.554 |
| 0.04879262595972389 | 0.18 |
| 0.6196204315375754 | 0.527 |
| 0.2758324167040268 | 0.131 |
| 0.8487112822668653 | 0.222 |
| 0.10155563013205371 | 0.271 |
| 0.9630156682264497 | 0.632 |
| 0.9396486917930489 | 0.539 |
| 0.687150815509418 | 0.114 |
| 0.16694841482530065 | 0.08 |
| 0.6161577319828709 | 0.416 |
| 0.28131170185075505 | 0.326 |
| 0.37774678368639725 | 0.098 |
| 0.18846379801173196 | 0.085 |
| 0.42182941130390217 | 0.07 |
| 0.787147492304583 | 0.452 |
| 0.8791386282768462 | 0.182 |
| 0.10627318916750439 | 0.075 |
| 0.44957581416152015 | 0.16 |
| 0.6938448925267556 | 0.049 |
| 0.693734390730028 | 0.127 |
| 0.9587953209954996 | 0.234 |
| 0.6140742087279375 | 0.124 |
| 0.05722632429448893 | 0.363 |